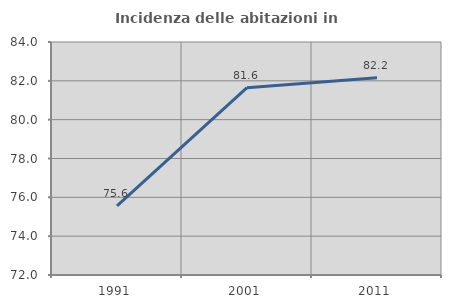
| Category | Incidenza delle abitazioni in proprietà  |
|---|---|
| 1991.0 | 75.558 |
| 2001.0 | 81.649 |
| 2011.0 | 82.158 |